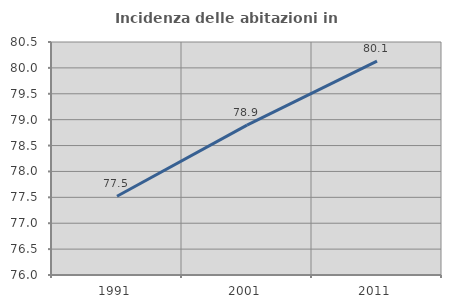
| Category | Incidenza delle abitazioni in proprietà  |
|---|---|
| 1991.0 | 77.52 |
| 2001.0 | 78.893 |
| 2011.0 | 80.131 |